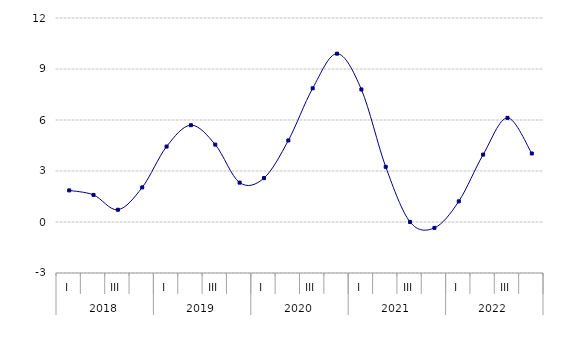
| Category | La Rioja  |
|---|---|
| 0 | 1.858 |
| 1 | 1.593 |
| 2 | 0.721 |
| 3 | 2.035 |
| 4 | 4.438 |
| 5 | 5.694 |
| 6 | 4.551 |
| 7 | 2.316 |
| 8 | 2.582 |
| 9 | 4.797 |
| 10 | 7.866 |
| 11 | 9.902 |
| 12 | 7.797 |
| 13 | 3.245 |
| 14 | 0.004 |
| 15 | -0.346 |
| 16 | 1.214 |
| 17 | 3.964 |
| 18 | 6.126 |
| 19 | 4.03 |